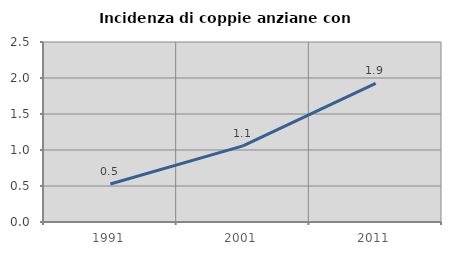
| Category | Incidenza di coppie anziane con figli |
|---|---|
| 1991.0 | 0.527 |
| 2001.0 | 1.058 |
| 2011.0 | 1.925 |